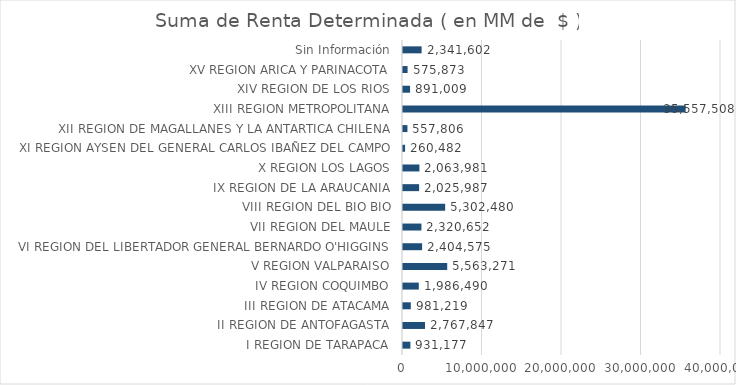
| Category | Series 0 |
|---|---|
|    I REGION DE TARAPACA | 931177 |
|   II REGION DE ANTOFAGASTA | 2767846.8 |
|  III REGION DE ATACAMA | 981218.9 |
|   IV REGION COQUIMBO | 1986489.9 |
|    V REGION VALPARAISO | 5563271 |
|   VI REGION DEL LIBERTADOR GENERAL BERNARDO O'HIGGINS | 2404574.8 |
|  VII REGION DEL MAULE | 2320652 |
| VIII REGION DEL BIO BIO | 5302479.7 |
|   IX REGION DE LA ARAUCANIA | 2025986.9 |
|    X REGION LOS LAGOS | 2063981.4 |
|   XI REGION AYSEN DEL GENERAL CARLOS IBAÑEZ DEL CAMPO | 260481.7 |
|  XII REGION DE MAGALLANES Y LA ANTARTICA CHILENA | 557805.7 |
| XIII REGION METROPOLITANA | 35557507.5 |
|  XIV REGION DE LOS RIOS | 891008.9 |
|   XV REGION ARICA Y PARINACOTA | 575872.7 |
| Sin Información | 2341602.2 |